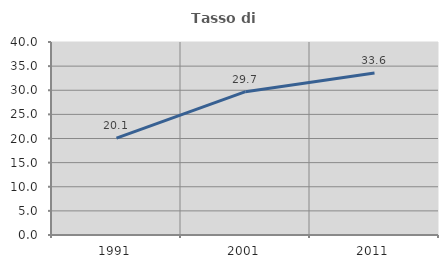
| Category | Tasso di occupazione   |
|---|---|
| 1991.0 | 20.082 |
| 2001.0 | 29.711 |
| 2011.0 | 33.587 |